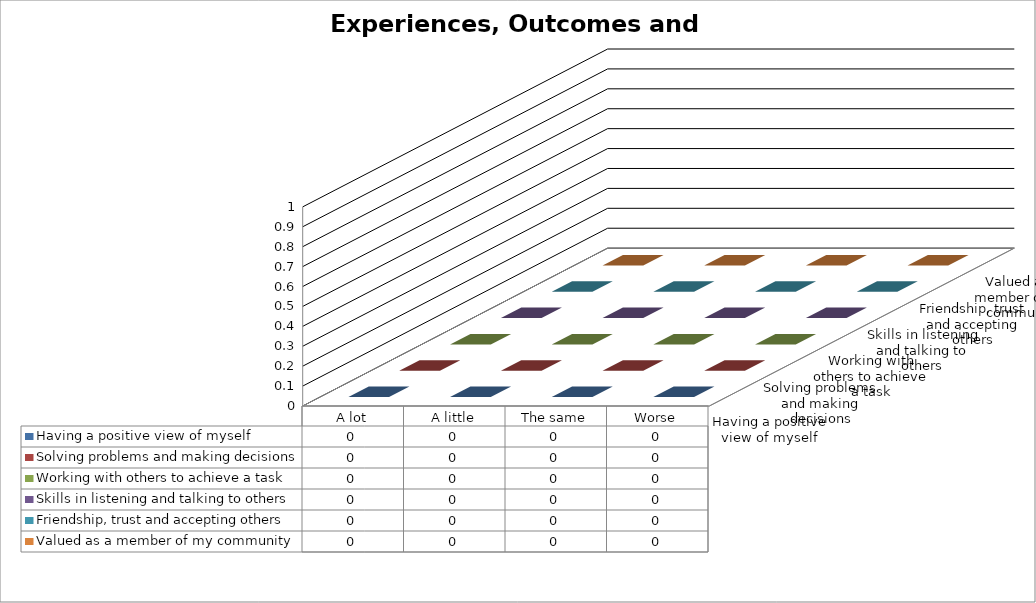
| Category | Having a positive view of myself | Solving problems and making decisions | Working with others to achieve a task | Skills in listening and talking to others | Friendship, trust and accepting others | Valued as a member of my community |
|---|---|---|---|---|---|---|
| A lot | 0 | 0 | 0 | 0 | 0 | 0 |
| A little | 0 | 0 | 0 | 0 | 0 | 0 |
| The same | 0 | 0 | 0 | 0 | 0 | 0 |
| Worse | 0 | 0 | 0 | 0 | 0 | 0 |